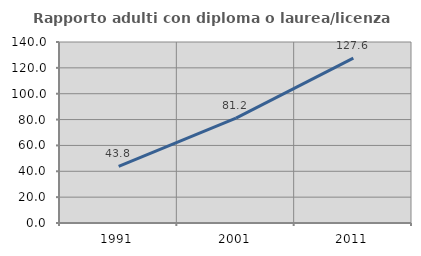
| Category | Rapporto adulti con diploma o laurea/licenza media  |
|---|---|
| 1991.0 | 43.796 |
| 2001.0 | 81.152 |
| 2011.0 | 127.586 |